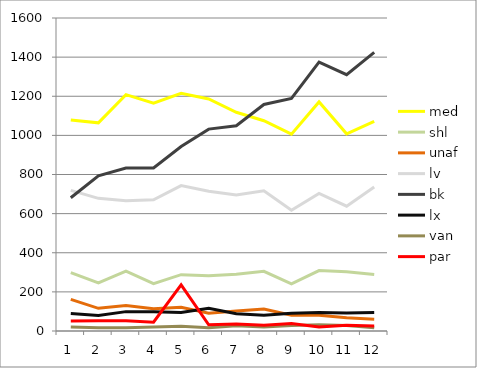
| Category | med | shl | unaf | lv | bk | lx | van | par |
|---|---|---|---|---|---|---|---|---|
| 1.0 | 1079 | 298 | 162 | 719 | 681 | 89 | 21 | 51 |
| 2.0 | 1064 | 246 | 116 | 678 | 793 | 79 | 16 | 53 |
| 3.0 | 1208 | 306 | 130 | 666 | 833 | 99 | 17 | 53 |
| 4.0 | 1165 | 242 | 114 | 671 | 833 | 99 | 20 | 45 |
| 5.0 | 1215 | 288 | 121 | 743 | 943 | 95 | 24 | 236 |
| 6.0 | 1186 | 282 | 91 | 714 | 1032 | 116 | 16 | 32 |
| 7.0 | 1118 | 290 | 102 | 695 | 1049 | 88 | 27 | 36 |
| 8.0 | 1075 | 305 | 112 | 717 | 1158 | 81 | 20 | 30 |
| 9.0 | 1006 | 241 | 81 | 617 | 1189 | 91 | 28 | 38 |
| 10.0 | 1171 | 309 | 80 | 703 | 1375 | 95 | 32 | 20 |
| 11.0 | 1008 | 303 | 68 | 638 | 1310 | 92 | 28 | 29 |
| 12.0 | 1071 | 289 | 60 | 736 | 1424 | 94 | 17 | 26 |